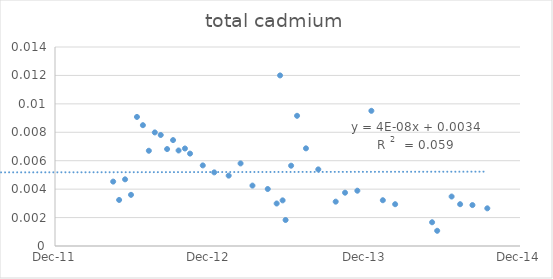
| Category | Series 0 |
|---|---|
| 41017.0 | 0.005 |
| 41031.0 | 0.003 |
| 41045.0 | 0.005 |
| 41059.0 | 0.004 |
| 41073.0 | 0.009 |
| 41087.0 | 0.008 |
| 41101.0 | 0.007 |
| 41115.0 | 0.008 |
| 41129.0 | 0.008 |
| 41144.0 | 0.007 |
| 41158.0 | 0.007 |
| 41171.0 | 0.007 |
| 41186.0 | 0.007 |
| 41198.0 | 0.006 |
| 41228.0 | 0.006 |
| 41255.0 | 0.005 |
| 41289.0 | 0.005 |
| 41317.0 | 0.006 |
| 41345.0 | 0.004 |
| 41381.0 | 0.004 |
| 41402.0 | 0.003 |
| 41410.0 | 0.012 |
| 41416.0 | 0.003 |
| 41423.0 | 0.002 |
| 41436.0 | 0.006 |
| 41450.0 | 0.009 |
| 41471.0 | 0.007 |
| 41500.0 | 0.005 |
| 41541.0 | 0.003 |
| 41563.0 | 0.004 |
| 41592.0 | 0.004 |
| 41625.0 | 0.01 |
| 41652.0 | 0.003 |
| 41681.0 | 0.003 |
| 41768.0 | 0.002 |
| 41780.0 | 0.001 |
| 41814.0 | 0.003 |
| 41834.0 | 0.003 |
| 41863.0 | 0.003 |
| 41898.0 | 0.003 |